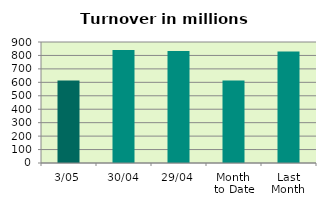
| Category | Series 0 |
|---|---|
| 3/05 | 613.152 |
| 30/04 | 839.726 |
| 29/04 | 832.652 |
| Month 
to Date | 613.152 |
| Last
Month | 829.993 |